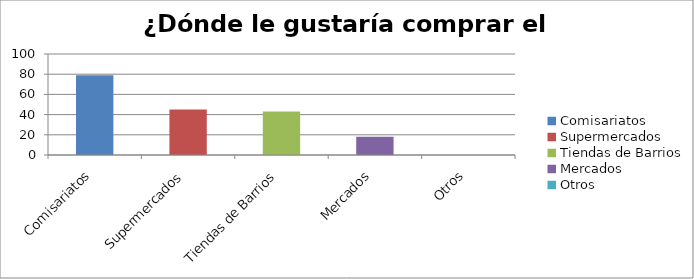
| Category | ¿Dónde le gustaría comprar el producto? |
|---|---|
| Comisariatos | 79 |
| Supermercados | 45 |
| Tiendas de Barrios | 43 |
| Mercados | 18 |
| Otros | 0 |